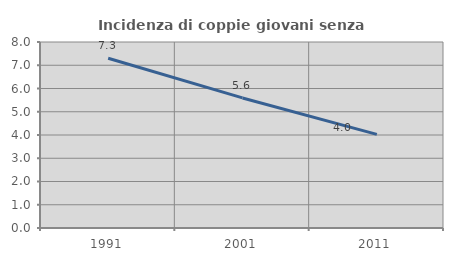
| Category | Incidenza di coppie giovani senza figli |
|---|---|
| 1991.0 | 7.299 |
| 2001.0 | 5.594 |
| 2011.0 | 4.025 |